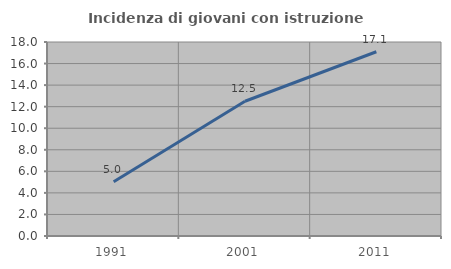
| Category | Incidenza di giovani con istruzione universitaria |
|---|---|
| 1991.0 | 5.036 |
| 2001.0 | 12.5 |
| 2011.0 | 17.094 |